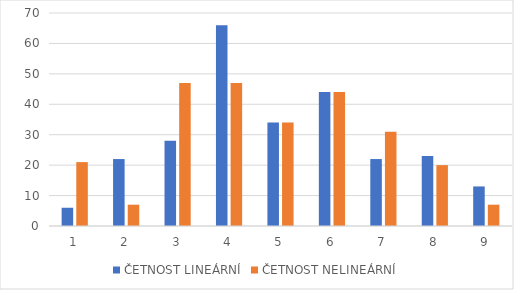
| Category | ČETNOST LINEÁRNÍ | ČETNOST NELINEÁRNÍ |
|---|---|---|
| 1.0 | 6 | 21 |
| 2.0 | 22 | 7 |
| 3.0 | 28 | 47 |
| 4.0 | 66 | 47 |
| 5.0 | 34 | 34 |
| 6.0 | 44 | 44 |
| 7.0 | 22 | 31 |
| 8.0 | 23 | 20 |
| 9.0 | 13 | 7 |